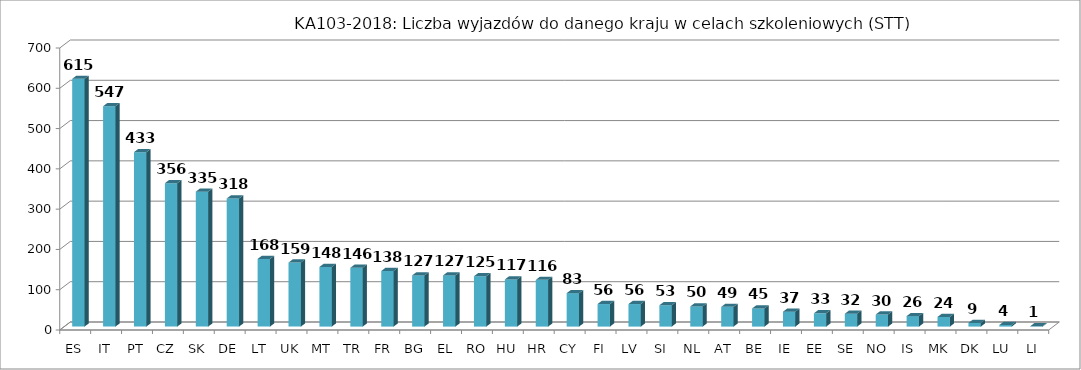
| Category | Liczba wyjazdów w celach szkoleniowych (STT) |
|---|---|
| ES | 615 |
| IT | 547 |
| PT | 433 |
| CZ | 356 |
| SK | 335 |
| DE | 318 |
| LT | 168 |
| UK | 159 |
| MT | 148 |
| TR | 146 |
| FR | 138 |
| BG | 127 |
| EL | 127 |
| RO | 125 |
| HU | 117 |
| HR | 116 |
| CY | 83 |
| FI | 56 |
| LV | 56 |
| SI | 53 |
| NL | 50 |
| AT | 49 |
| BE | 45 |
| IE | 37 |
| EE | 33 |
| SE | 32 |
| NO | 30 |
| IS | 26 |
| MK | 24 |
| DK | 9 |
| LU | 4 |
| LI | 1 |